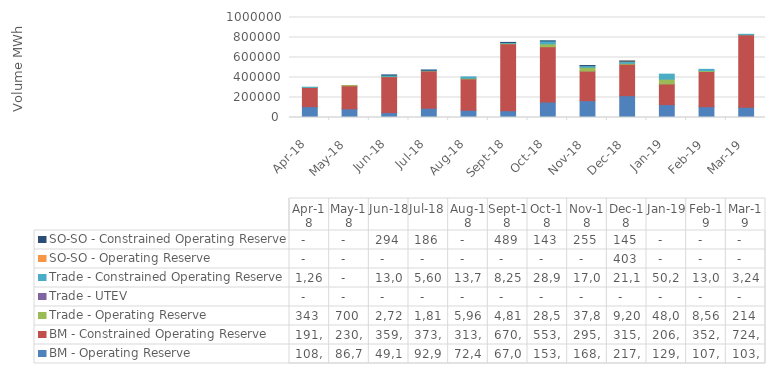
| Category | BM - Operating Reserve | BM - Constrained Operating Reserve | Trade - Operating Reserve | Trade - UTEV | Trade - Constrained Operating Reserve | SO-SO - Operating Reserve | SO-SO - Constrained Operating Reserve |
|---|---|---|---|---|---|---|---|
| 2018-04-30 | 108968.126 | 191477.044 | 343 | 0 | 1263 | 0 | 0 |
| 2018-05-31 | 86765.995 | 230519.796 | 700 | 0 | 0 | 0 | 0 |
| 2018-06-30 | 49167.505 | 359282.166 | 2719.5 | 0 | 13092.5 | 0 | 293.545 |
| 2018-07-31 | 92971.87 | 373393.366 | 1813 | 0 | 5609 | 0 | 185.96 |
| 2018-08-31 | 72419.187 | 313812.042 | 5963 | 0 | 13791 | 0 | 0 |
| 2018-09-30 | 67011.687 | 670268.276 | 4812 | 0 | 8258 | 0 | 489.306 |
| 2018-10-31 | 153871.56 | 553962.884 | 28538.5 | 0 | 28967.5 | 0 | 142.865 |
| 2018-11-30 | 168277.989 | 295754.003 | 37815.5 | 0 | 17078.5 | 0 | 255.389 |
| 2018-12-31 | 217741.361 | 315121.985 | 9202.5 | 0 | 21133.5 | 402.912 | 144.506 |
| 2019-01-31 | 129042.436 | 206149.134 | 48033 | 0 | 50286.5 | 0 | 0 |
| 2019-02-28 | 107765.434 | 352215.631 | 8568.75 | 0 | 13025.75 | 0 | 0 |
| 2019-03-31 | 103717.09 | 724512.501 | 214 | 0 | 3246 | 0 | 0 |